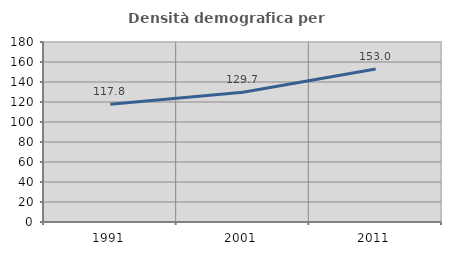
| Category | Densità demografica |
|---|---|
| 1991.0 | 117.783 |
| 2001.0 | 129.677 |
| 2011.0 | 153.01 |